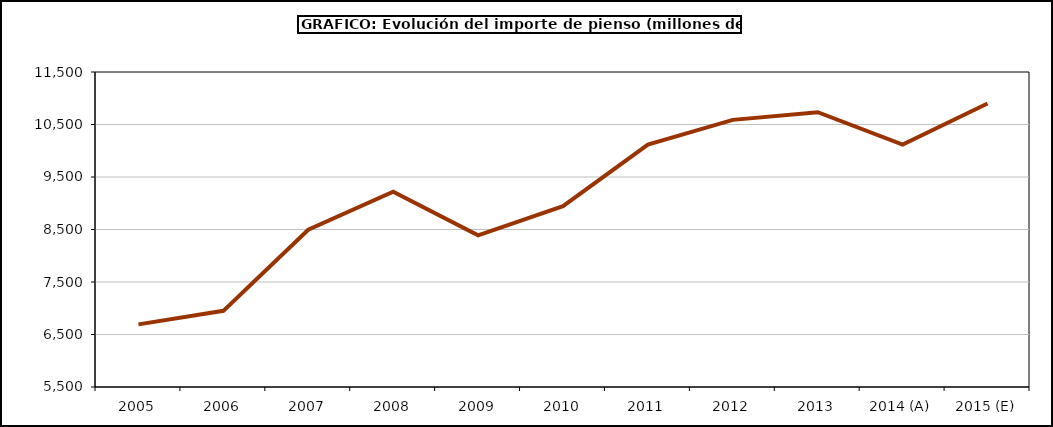
| Category | piensos |
|---|---|
| 2005 | 6693.171 |
| 2006 | 6950.753 |
| 2007 | 8496.174 |
| 2008 | 9220.925 |
| 2009 | 8388.144 |
| 2010 | 8943.629 |
| 2011 | 10115.595 |
| 2012 | 10588.115 |
| 2013 | 10733.318 |
| 2014 (A) | 10117.523 |
| 2015 (E) | 10900.557 |